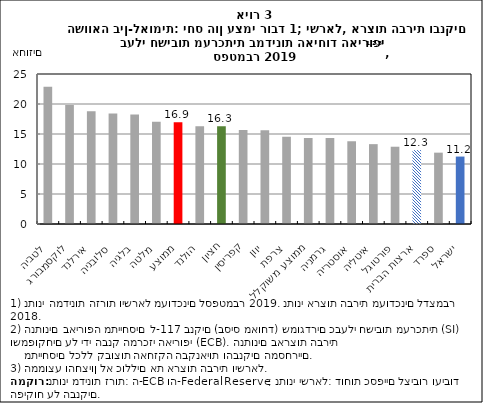
| Category | יחס הון עצמי רובד 1 |
|---|---|
| לטביה | 22.88 |
| לוקסמבורג | 19.85 |
| אירלנד | 18.78 |
| סלובניה | 18.43 |
| בלגיה | 18.26 |
| מלטה | 17.03 |
| ממוצע | 16.941 |
| הולנד | 16.3 |
| חציון | 16.3 |
| קפריסין | 15.67 |
| יוון | 15.62 |
| צרפת | 14.55 |
| ממוצע משוקלל | 14.34 |
| גרמניה | 14.33 |
| אוסטריה | 13.79 |
| איטליה | 13.31 |
| פורטוגל | 12.88 |
| ארצות הברית | 12.319 |
| ספרד | 11.89 |
| ישראל | 11.24 |